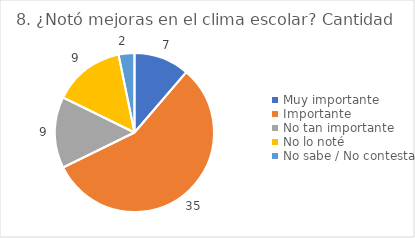
| Category | 8. ¿Notó mejoras en el clima escolar? |
|---|---|
| Muy importante  | 0.113 |
| Importante  | 0.565 |
| No tan importante  | 0.145 |
| No lo noté  | 0.145 |
| No sabe / No contesta | 0.032 |